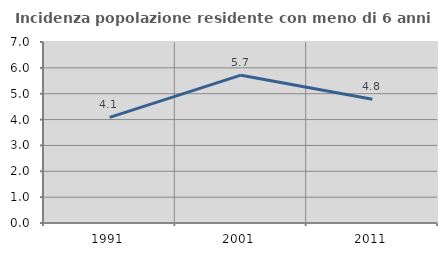
| Category | Incidenza popolazione residente con meno di 6 anni |
|---|---|
| 1991.0 | 4.086 |
| 2001.0 | 5.716 |
| 2011.0 | 4.783 |